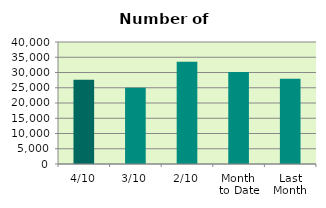
| Category | Series 0 |
|---|---|
| 4/10 | 27592 |
| 3/10 | 24968 |
| 2/10 | 33500 |
| Month 
to Date | 30196.5 |
| Last
Month | 27963.2 |